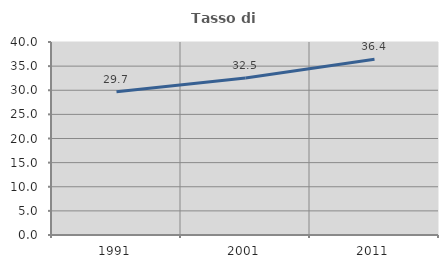
| Category | Tasso di occupazione   |
|---|---|
| 1991.0 | 29.681 |
| 2001.0 | 32.519 |
| 2011.0 | 36.402 |